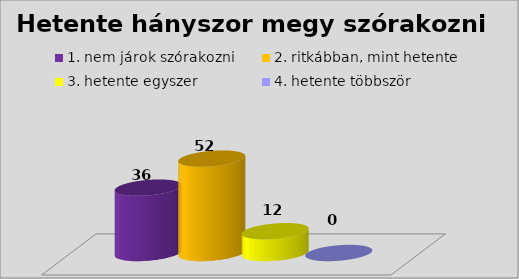
| Category | 1. nem járok szórakozni | 2. ritkábban, mint hetente | 3. hetente egyszer | 4. hetente többször |
|---|---|---|---|---|
| 0 | 36 | 52 | 12 | 0 |